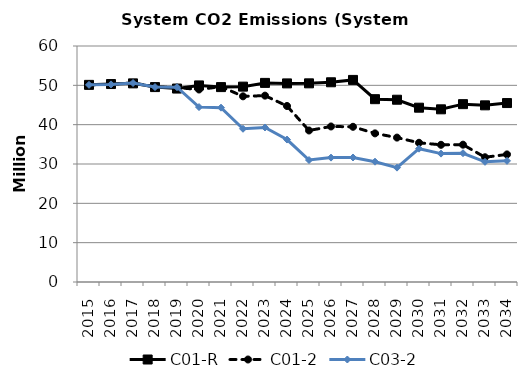
| Category | C01-R | C01-2 | C03-2 |
|---|---|---|---|
| 2015.0 | 50.118 | 50.118 | 50.119 |
| 2016.0 | 50.329 | 50.238 | 50.239 |
| 2017.0 | 50.499 | 50.622 | 50.593 |
| 2018.0 | 49.555 | 49.636 | 49.559 |
| 2019.0 | 49.181 | 49.421 | 49.523 |
| 2020.0 | 49.976 | 48.938 | 44.472 |
| 2021.0 | 49.548 | 49.665 | 44.321 |
| 2022.0 | 49.671 | 47.203 | 38.96 |
| 2023.0 | 50.618 | 47.383 | 39.286 |
| 2024.0 | 50.491 | 44.746 | 36.214 |
| 2025.0 | 50.508 | 38.519 | 31.012 |
| 2026.0 | 50.777 | 39.539 | 31.624 |
| 2027.0 | 51.38 | 39.462 | 31.654 |
| 2028.0 | 46.481 | 37.785 | 30.585 |
| 2029.0 | 46.342 | 36.715 | 29.075 |
| 2030.0 | 44.317 | 35.397 | 33.898 |
| 2031.0 | 43.901 | 34.881 | 32.639 |
| 2032.0 | 45.215 | 34.915 | 32.738 |
| 2033.0 | 44.915 | 31.713 | 30.55 |
| 2034.0 | 45.496 | 32.435 | 30.799 |